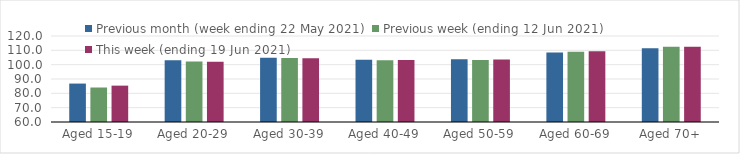
| Category | Previous month (week ending 22 May 2021) | Previous week (ending 12 Jun 2021) | This week (ending 19 Jun 2021) |
|---|---|---|---|
| Aged 15-19 | 86.81 | 84.07 | 85.37 |
| Aged 20-29 | 103 | 102.28 | 101.98 |
| Aged 30-39 | 104.83 | 104.64 | 104.46 |
| Aged 40-49 | 103.48 | 103.03 | 103.19 |
| Aged 50-59 | 103.78 | 103.34 | 103.54 |
| Aged 60-69 | 108.54 | 109.09 | 109.28 |
| Aged 70+ | 111.41 | 112.44 | 112.43 |